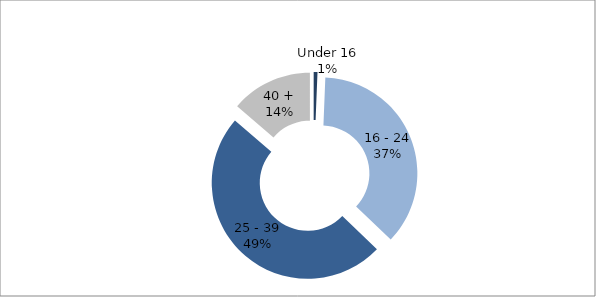
| Category | Series 0 |
|---|---|
| Under 16 | 4 |
| 16 - 24 | 229 |
| 25 - 39 | 308 |
| 40 + | 86 |